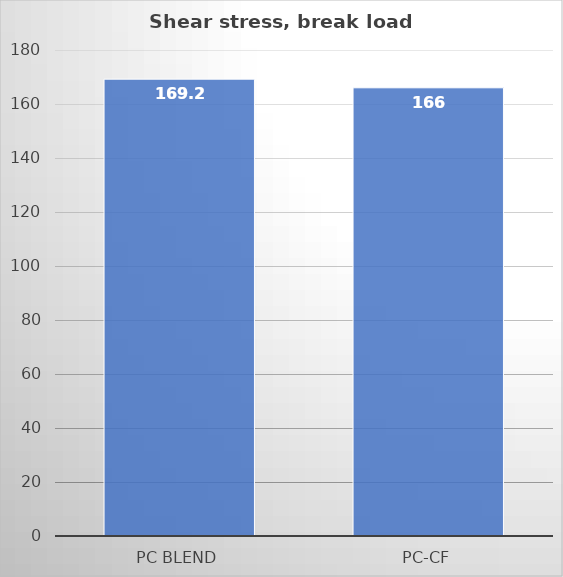
| Category | Break kg |
|---|---|
| PC blend | 169.2 |
| PC-CF | 166 |